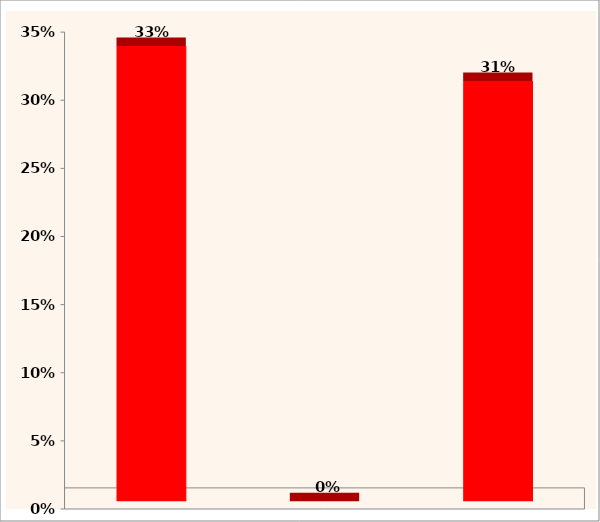
| Category | Series 0 |
|---|---|
| 0 | 0.334 |
| 1 | 0 |
| 2 | 0.308 |